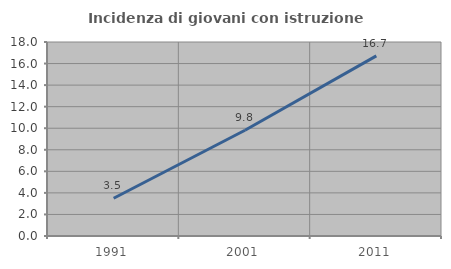
| Category | Incidenza di giovani con istruzione universitaria |
|---|---|
| 1991.0 | 3.503 |
| 2001.0 | 9.813 |
| 2011.0 | 16.716 |